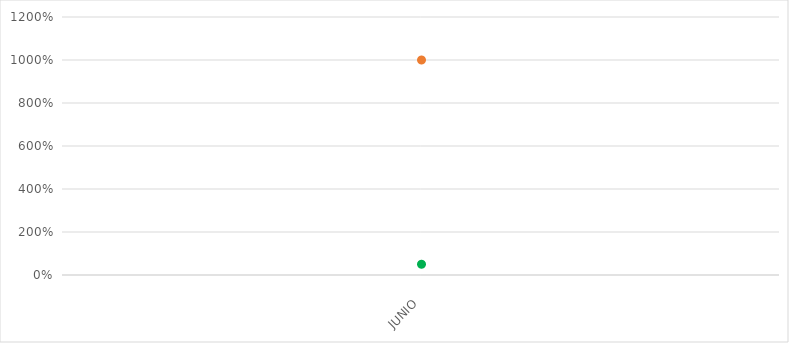
| Category | VALOR  | META PONDERADA |
|---|---|---|
| JUNIO | 10 | 0.5 |